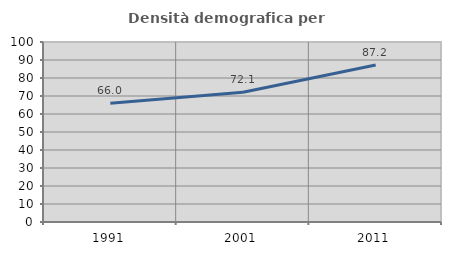
| Category | Densità demografica |
|---|---|
| 1991.0 | 66.032 |
| 2001.0 | 72.071 |
| 2011.0 | 87.223 |